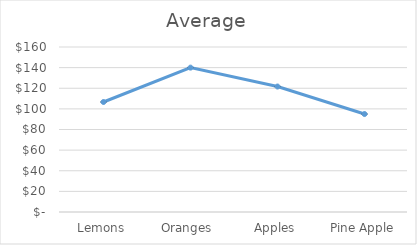
| Category | Average |
|---|---|
| Lemons | 106.667 |
| Oranges  | 140 |
| Apples | 121.667 |
| Pine Apple | 95 |